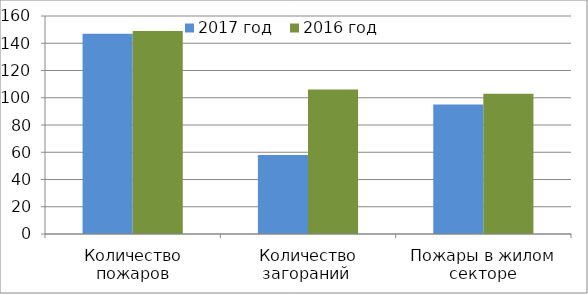
| Category | 2017 год | 2016 год |
|---|---|---|
| Количество пожаров | 147 | 149 |
| Количество загораний  | 58 | 106 |
| Пожары в жилом секторе | 95 | 103 |